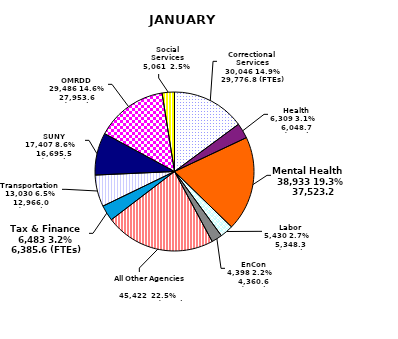
| Category | January 1990 |
|---|---|
| Correctional Services    30,046 14.9%    29,776.8 (FTEs) | 30046 |
| Health    6,309 3.1%   6,048.7 (FTEs) | 6309 |
| Mental Health    38,933 19.3%    37,523.2 (FTEs) | 38933 |
| Labor    5,430 2.7%    5,348.3 (FTEs) | 5430 |
| EnCon    4,398 2.2%    4,360.6 (FTEs) | 4398 |
| All Other Agencies    45,422  22.5%    44694.3.4 (FTEs) | 45422 |
| Tax & Finance    6,483 3.2%    6,385.6 (FTEs) | 6483 |
| Transportation    13,030 6.5%    12,966.0 (FTEs) | 13030 |
| SUNY    17,407 8.6%    16,695.5 (FTEs) | 17407 |
| OMRDD    29,486 14.6%    27,953.6 (FTEs) | 29486 |
| Social Services    5,061 2.5%    4,938.5 (FTEs) | 5061 |